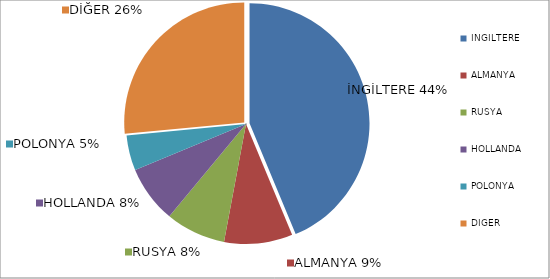
| Category | Series 0 |
|---|---|
| İNGİLTERE | 444216 |
| ALMANYA | 93616 |
| RUSYA | 82177 |
| HOLLANDA | 78453 |
| POLONYA | 48123 |
| DİĞER | 269405 |